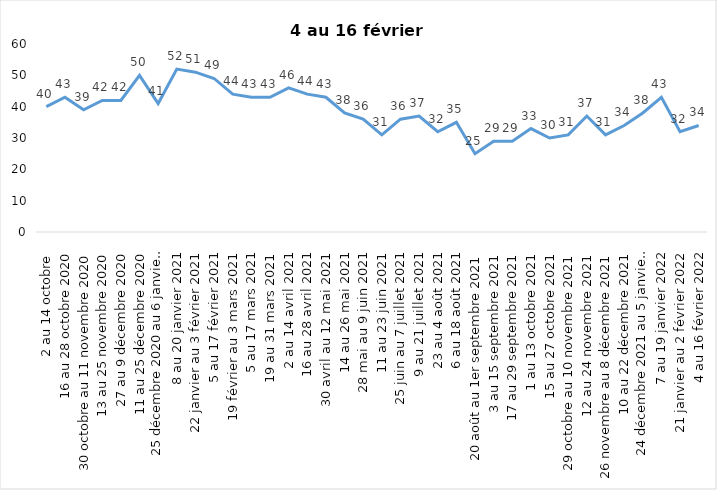
| Category | Toujours aux trois mesures |
|---|---|
| 2 au 14 octobre  | 40 |
| 16 au 28 octobre 2020 | 43 |
| 30 octobre au 11 novembre 2020 | 39 |
| 13 au 25 novembre 2020 | 42 |
| 27 au 9 décembre 2020 | 42 |
| 11 au 25 décembre 2020 | 50 |
| 25 décembre 2020 au 6 janvier 2021 | 41 |
| 8 au 20 janvier 2021 | 52 |
| 22 janvier au 3 février 2021 | 51 |
| 5 au 17 février 2021 | 49 |
| 19 février au 3 mars 2021 | 44 |
| 5 au 17 mars 2021 | 43 |
| 19 au 31 mars 2021 | 43 |
| 2 au 14 avril 2021 | 46 |
| 16 au 28 avril 2021 | 44 |
| 30 avril au 12 mai 2021 | 43 |
| 14 au 26 mai 2021 | 38 |
| 28 mai au 9 juin 2021 | 36 |
| 11 au 23 juin 2021 | 31 |
| 25 juin au 7 juillet 2021 | 36 |
| 9 au 21 juillet 2021 | 37 |
| 23 au 4 août 2021 | 32 |
| 6 au 18 août 2021 | 35 |
| 20 août au 1er septembre 2021 | 25 |
| 3 au 15 septembre 2021 | 29 |
| 17 au 29 septembre 2021 | 29 |
| 1 au 13 octobre 2021 | 33 |
| 15 au 27 octobre 2021 | 30 |
| 29 octobre au 10 novembre 2021 | 31 |
| 12 au 24 novembre 2021 | 37 |
| 26 novembre au 8 décembre 2021 | 31 |
| 10 au 22 décembre 2021 | 34 |
| 24 décembre 2021 au 5 janvier 2022 2022 | 38 |
| 7 au 19 janvier 2022 | 43 |
| 21 janvier au 2 février 2022 | 32 |
| 4 au 16 février 2022 | 34 |